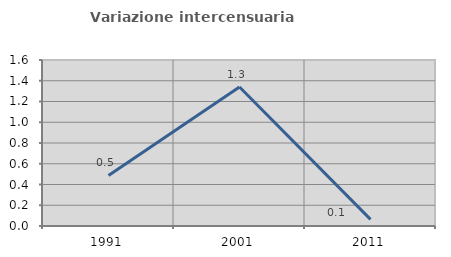
| Category | Variazione intercensuaria annua |
|---|---|
| 1991.0 | 0.487 |
| 2001.0 | 1.34 |
| 2011.0 | 0.064 |